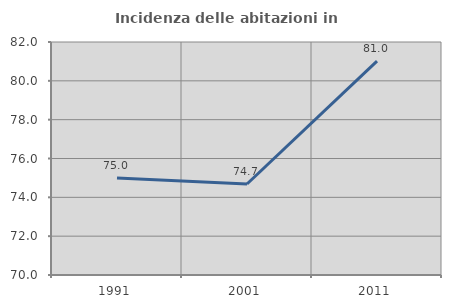
| Category | Incidenza delle abitazioni in proprietà  |
|---|---|
| 1991.0 | 75 |
| 2001.0 | 74.687 |
| 2011.0 | 81.018 |